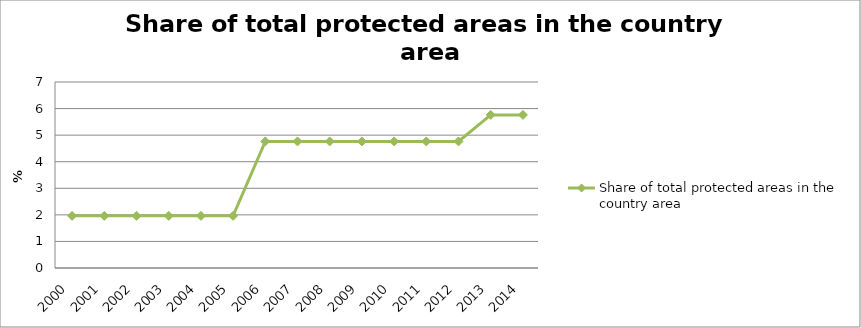
| Category | Share of total protected areas in the country area  |
|---|---|
| 2000.0 | 1.962 |
| 2001.0 | 1.962 |
| 2002.0 | 1.962 |
| 2003.0 | 1.962 |
| 2004.0 | 1.962 |
| 2005.0 | 1.962 |
| 2006.0 | 4.763 |
| 2007.0 | 4.763 |
| 2008.0 | 4.763 |
| 2009.0 | 4.763 |
| 2010.0 | 4.763 |
| 2011.0 | 4.763 |
| 2012.0 | 4.763 |
| 2013.0 | 5.762 |
| 2014.0 | 5.762 |